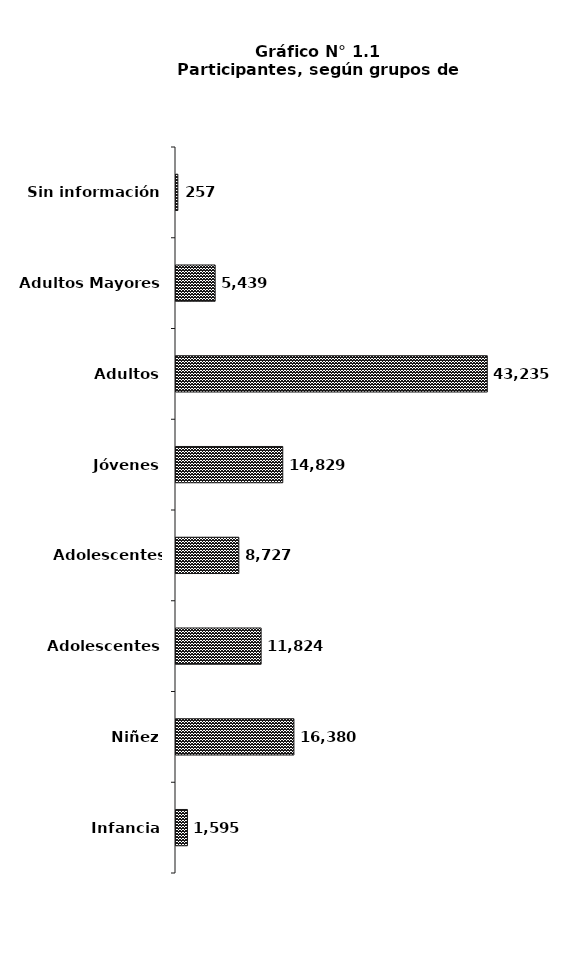
| Category | Series 0 |
|---|---|
| Infancia | 1595 |
| Niñez | 16380 |
| Adolescentes | 11824 |
| Adolescentes Tardios | 8727 |
| Jóvenes | 14829 |
| Adultos | 43235 |
| Adultos Mayores | 5439 |
| Sin información | 257 |